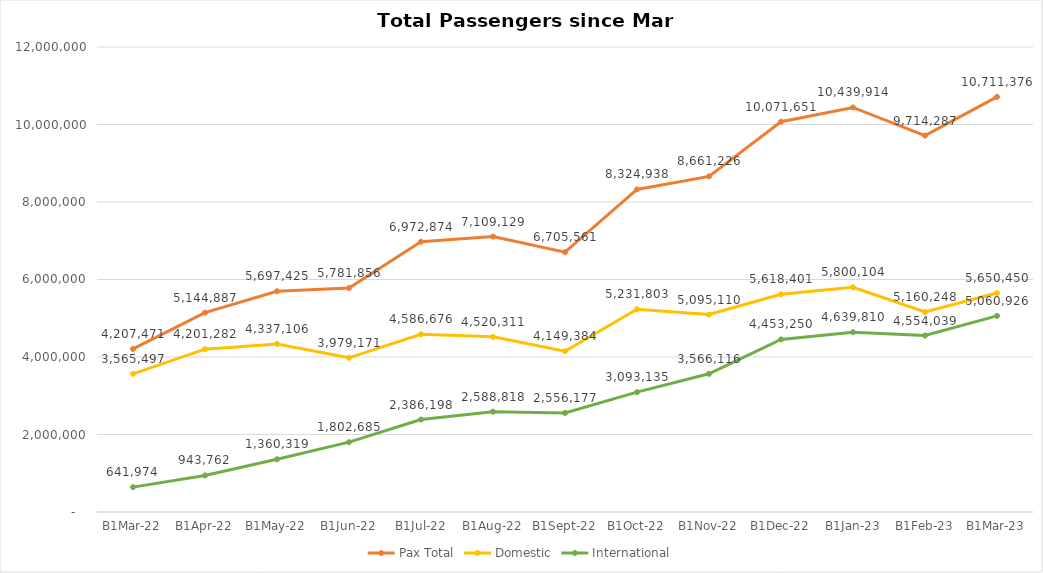
| Category | Pax Total |  Domestic  |  International  |
|---|---|---|---|
| 2022-03-01 | 4207471 | 3565497 | 641974 |
| 2022-04-01 | 5144887 | 4201282 | 943762 |
| 2022-05-01 | 5697425 | 4337106 | 1360319 |
| 2022-06-01 | 5781856 | 3979171 | 1802685 |
| 2022-07-01 | 6972874 | 4586676 | 2386198 |
| 2022-08-01 | 7109129 | 4520311 | 2588818 |
| 2022-09-01 | 6705561 | 4149384 | 2556177 |
| 2022-10-01 | 8324938 | 5231803 | 3093135 |
| 2022-11-01 | 8661226 | 5095110 | 3566116 |
| 2022-12-01 | 10071651 | 5618401 | 4453250 |
| 2023-01-01 | 10439914 | 5800104 | 4639810 |
| 2023-02-01 | 9714287 | 5160248 | 4554039 |
| 2023-03-01 | 10711376 | 5650450 | 5060926 |